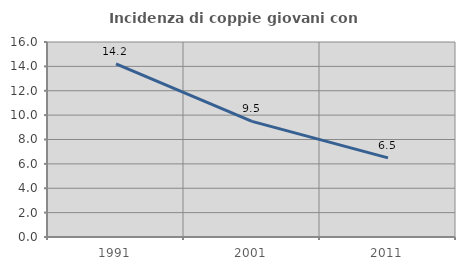
| Category | Incidenza di coppie giovani con figli |
|---|---|
| 1991.0 | 14.206 |
| 2001.0 | 9.489 |
| 2011.0 | 6.494 |